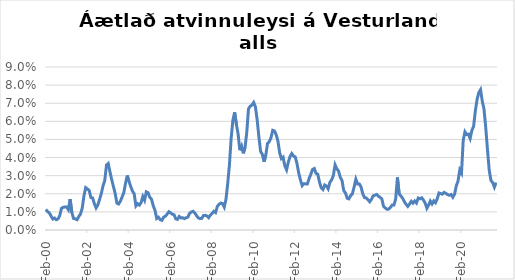
| Category | Series 0 |
|---|---|
| 2000-02-01 | 0.011 |
| 2000-03-01 | 0.01 |
| 2000-04-01 | 0.009 |
| 2000-05-01 | 0.008 |
| 2000-06-01 | 0.006 |
| 2000-07-01 | 0.007 |
| 2000-08-01 | 0.006 |
| 2000-09-01 | 0.006 |
| 2000-10-01 | 0.008 |
| 2000-11-01 | 0.012 |
| 2000-12-01 | 0.013 |
| 2001-01-01 | 0.013 |
| 2001-02-01 | 0.013 |
| 2001-03-01 | 0.011 |
| 2001-04-01 | 0.017 |
| 2001-05-01 | 0.01 |
| 2001-06-01 | 0.006 |
| 2001-07-01 | 0.006 |
| 2001-08-01 | 0.006 |
| 2001-09-01 | 0.007 |
| 2001-10-01 | 0.009 |
| 2001-11-01 | 0.012 |
| 2001-12-01 | 0.019 |
| 2002-01-01 | 0.023 |
| 2002-02-01 | 0.023 |
| 2002-03-01 | 0.022 |
| 2002-04-01 | 0.018 |
| 2002-05-01 | 0.018 |
| 2002-06-01 | 0.015 |
| 2002-07-01 | 0.012 |
| 2002-08-01 | 0.014 |
| 2002-09-01 | 0.017 |
| 2002-10-01 | 0.02 |
| 2002-11-01 | 0.024 |
| 2002-12-01 | 0.027 |
| 2003-01-01 | 0.036 |
| 2003-02-01 | 0.037 |
| 2003-03-01 | 0.032 |
| 2003-04-01 | 0.028 |
| 2003-05-01 | 0.024 |
| 2003-06-01 | 0.02 |
| 2003-07-01 | 0.015 |
| 2003-08-01 | 0.014 |
| 2003-09-01 | 0.016 |
| 2003-10-01 | 0.018 |
| 2003-11-01 | 0.021 |
| 2003-12-01 | 0.026 |
| 2004-01-01 | 0.03 |
| 2004-02-01 | 0.027 |
| 2004-03-01 | 0.024 |
| 2004-04-01 | 0.021 |
| 2004-05-01 | 0.02 |
| 2004-06-01 | 0.013 |
| 2004-07-01 | 0.014 |
| 2004-08-01 | 0.014 |
| 2004-09-01 | 0.015 |
| 2004-10-01 | 0.019 |
| 2004-11-01 | 0.016 |
| 2004-12-01 | 0.021 |
| 2005-01-01 | 0.021 |
| 2005-02-01 | 0.018 |
| 2005-03-01 | 0.017 |
| 2005-04-01 | 0.013 |
| 2005-05-01 | 0.011 |
| 2005-06-01 | 0.006 |
| 2005-07-01 | 0.007 |
| 2005-08-01 | 0.006 |
| 2005-09-01 | 0.005 |
| 2005-10-01 | 0.007 |
| 2005-11-01 | 0.008 |
| 2005-12-01 | 0.009 |
| 2006-01-01 | 0.01 |
| 2006-02-01 | 0.009 |
| 2006-03-01 | 0.009 |
| 2006-04-01 | 0.008 |
| 2006-05-01 | 0.006 |
| 2006-06-01 | 0.006 |
| 2006-07-01 | 0.007 |
| 2006-08-01 | 0.007 |
| 2006-09-01 | 0.007 |
| 2006-10-01 | 0.006 |
| 2006-11-01 | 0.007 |
| 2006-12-01 | 0.007 |
| 2007-01-01 | 0.009 |
| 2007-02-01 | 0.01 |
| 2007-03-01 | 0.01 |
| 2007-04-01 | 0.009 |
| 2007-05-01 | 0.008 |
| 2007-06-01 | 0.007 |
| 2007-07-01 | 0.006 |
| 2007-08-01 | 0.006 |
| 2007-09-01 | 0.008 |
| 2007-10-01 | 0.008 |
| 2007-11-01 | 0.008 |
| 2007-12-01 | 0.007 |
| 2008-01-01 | 0.008 |
| 2008-02-01 | 0.009 |
| 2008-03-01 | 0.01 |
| 2008-04-01 | 0.01 |
| 2008-05-01 | 0.013 |
| 2008-06-01 | 0.014 |
| 2008-07-01 | 0.015 |
| 2008-08-01 | 0.015 |
| 2008-09-01 | 0.013 |
| 2008-10-01 | 0.017 |
| 2008-11-01 | 0.026 |
| 2008-12-01 | 0.036 |
| 2009-01-01 | 0.051 |
| 2009-02-01 | 0.061 |
| 2009-03-01 | 0.065 |
| 2009-04-01 | 0.058 |
| 2009-05-01 | 0.053 |
| 2009-06-01 | 0.044 |
| 2009-07-01 | 0.046 |
| 2009-08-01 | 0.042 |
| 2009-09-01 | 0.046 |
| 2009-10-01 | 0.054 |
| 2009-11-01 | 0.067 |
| 2009-12-01 | 0.068 |
| 2010-01-01 | 0.069 |
| 2010-02-01 | 0.07 |
| 2010-03-01 | 0.068 |
| 2010-04-01 | 0.061 |
| 2010-05-01 | 0.052 |
| 2010-06-01 | 0.043 |
| 2010-07-01 | 0.042 |
| 2010-08-01 | 0.038 |
| 2010-09-01 | 0.041 |
| 2010-10-01 | 0.048 |
| 2010-11-01 | 0.049 |
| 2010-12-01 | 0.051 |
| 2011-01-01 | 0.055 |
| 2011-02-01 | 0.055 |
| 2011-03-01 | 0.053 |
| 2011-04-01 | 0.049 |
| 2011-05-01 | 0.043 |
| 2011-06-01 | 0.039 |
| 2011-07-01 | 0.04 |
| 2011-08-01 | 0.035 |
| 2011-09-01 | 0.033 |
| 2011-10-01 | 0.037 |
| 2011-11-01 | 0.041 |
| 2011-12-01 | 0.042 |
| 2012-01-01 | 0.041 |
| 2012-02-01 | 0.04 |
| 2012-03-01 | 0.037 |
| 2012-04-01 | 0.031 |
| 2012-05-01 | 0.028 |
| 2012-06-01 | 0.024 |
| 2012-07-01 | 0.026 |
| 2012-08-01 | 0.025 |
| 2012-09-01 | 0.025 |
| 2012-10-01 | 0.028 |
| 2012-11-01 | 0.031 |
| 2012-12-01 | 0.033 |
| 2013-01-01 | 0.034 |
| 2013-02-01 | 0.031 |
| 2013-03-01 | 0.031 |
| 2013-04-01 | 0.026 |
| 2013-05-01 | 0.023 |
| 2013-06-01 | 0.022 |
| 2013-07-01 | 0.025 |
| 2013-08-01 | 0.024 |
| 2013-09-01 | 0.023 |
| 2013-10-01 | 0.026 |
| 2013-11-01 | 0.028 |
| 2013-12-01 | 0.03 |
| 2014-01-01 | 0.036 |
| 2014-02-01 | 0.034 |
| 2014-03-01 | 0.033 |
| 2014-04-01 | 0.029 |
| 2014-05-01 | 0.027 |
| 2014-06-01 | 0.022 |
| 2014-07-01 | 0.02 |
| 2014-08-01 | 0.018 |
| 2014-09-01 | 0.017 |
| 2014-10-01 | 0.019 |
| 2014-11-01 | 0.02 |
| 2014-12-01 | 0.024 |
| 2015-01-01 | 0.028 |
| 2015-02-01 | 0.025 |
| 2015-03-01 | 0.025 |
| 2015-04-01 | 0.024 |
| 2015-05-01 | 0.02 |
| 2015-06-01 | 0.018 |
| 2015-07-01 | 0.018 |
| 2015-08-01 | 0.017 |
| 2015-09-01 | 0.016 |
| 2015-10-01 | 0.017 |
| 2015-11-01 | 0.019 |
| 2015-12-01 | 0.019 |
| 2016-01-01 | 0.02 |
| 2016-02-01 | 0.019 |
| 2016-03-01 | 0.018 |
| 2016-04-01 | 0.017 |
| 2016-05-01 | 0.013 |
| 2016-06-01 | 0.012 |
| 2016-07-01 | 0.011 |
| 2016-08-01 | 0.012 |
| 2016-09-01 | 0.013 |
| 2016-10-01 | 0.014 |
| 2016-11-01 | 0.014 |
| 2016-12-01 | 0.017 |
| 2017-01-01 | 0.029 |
| 2017-02-01 | 0.02 |
| 2017-03-01 | 0.019 |
| 2017-04-01 | 0.018 |
| 2017-05-01 | 0.016 |
| 2017-06-01 | 0.014 |
| 2017-07-01 | 0.013 |
| 2017-08-01 | 0.014 |
| 2017-09-01 | 0.016 |
| 2017-10-01 | 0.015 |
| 2017-11-01 | 0.016 |
| 2017-12-01 | 0.015 |
| 2018-01-01 | 0.018 |
| 2018-02-01 | 0.017 |
| 2018-03-01 | 0.018 |
| 2018-04-01 | 0.017 |
| 2018-05-01 | 0.015 |
| 2018-06-01 | 0.012 |
| 2018-07-01 | 0.014 |
| 2018-08-01 | 0.016 |
| 2018-09-01 | 0.014 |
| 2018-10-01 | 0.016 |
| 2018-11-01 | 0.015 |
| 2018-12-01 | 0.017 |
| 2019-01-01 | 0.02 |
| 2019-02-01 | 0.02 |
| 2019-03-01 | 0.02 |
| 2019-04-01 | 0.021 |
| 2019-05-01 | 0.02 |
| 2019-06-01 | 0.02 |
| 2019-07-01 | 0.019 |
| 2019-08-01 | 0.02 |
| 2019-09-01 | 0.018 |
| 2019-10-01 | 0.02 |
| 2019-11-01 | 0.024 |
| 2019-12-01 | 0.027 |
| 2020-01-01 | 0.033 |
| 2020-02-01 | 0.031 |
| 2020-03-01 | 0.05 |
| 2020-04-01 | 0.054 |
| 2020-05-01 | 0.053 |
| 2020-06-01 | 0.053 |
| 2020-07-01 | 0.051 |
| 2020-08-01 | 0.055 |
| 2020-09-01 | 0.057 |
| 2020-10-01 | 0.066 |
| 2020-11-01 | 0.072 |
| 2020-12-01 | 0.076 |
| 2021-01-01 | 0.077 |
| 2021-02-01 | 0.071 |
| 2021-03-01 | 0.067 |
| 2021-04-01 | 0.057 |
| 2021-05-01 | 0.044 |
| 2021-06-01 | 0.033 |
| 2021-07-01 | 0.027 |
| 2021-08-01 | 0.026 |
| 2021-09-01 | 0.024 |
| 2021-10-01 | 0.026 |